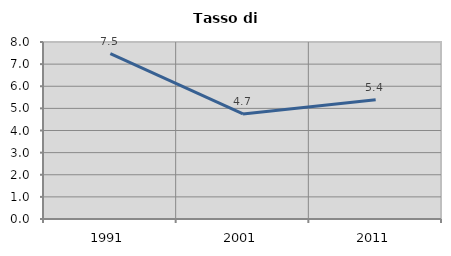
| Category | Tasso di disoccupazione   |
|---|---|
| 1991.0 | 7.471 |
| 2001.0 | 4.746 |
| 2011.0 | 5.391 |